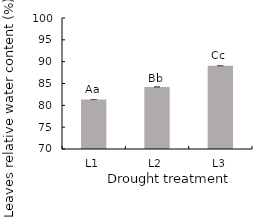
| Category | Leaves Relative water content |
|---|---|
| L1 | 81.324 |
| L2 | 84.22 |
| L3 | 89.072 |